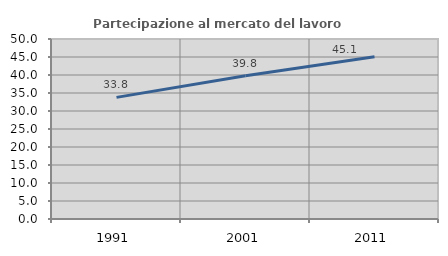
| Category | Partecipazione al mercato del lavoro  femminile |
|---|---|
| 1991.0 | 33.782 |
| 2001.0 | 39.817 |
| 2011.0 | 45.073 |